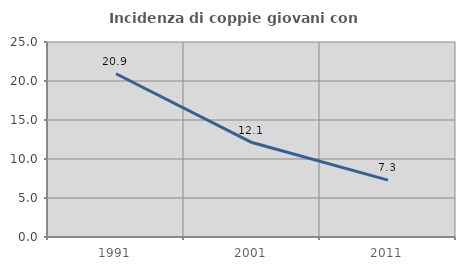
| Category | Incidenza di coppie giovani con figli |
|---|---|
| 1991.0 | 20.926 |
| 2001.0 | 12.111 |
| 2011.0 | 7.292 |